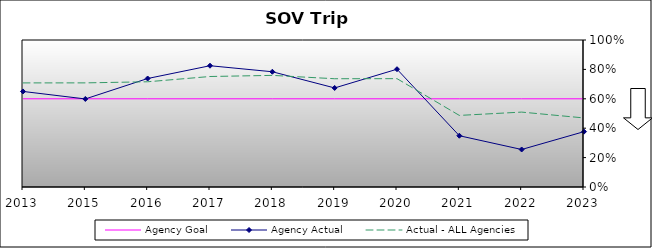
| Category | Agency Goal | Agency Actual | Actual - ALL Agencies |
|---|---|---|---|
| 2013.0 | 0.6 | 0.65 | 0.708 |
| 2015.0 | 0.6 | 0.599 | 0.708 |
| 2016.0 | 0.6 | 0.738 | 0.716 |
| 2017.0 | 0.6 | 0.825 | 0.752 |
| 2018.0 | 0.6 | 0.784 | 0.759 |
| 2019.0 | 0.6 | 0.674 | 0.736 |
| 2020.0 | 0.6 | 0.801 | 0.737 |
| 2021.0 | 0.6 | 0.349 | 0.487 |
| 2022.0 | 0.6 | 0.255 | 0.509 |
| 2023.0 | 0.6 | 0.376 | 0.47 |